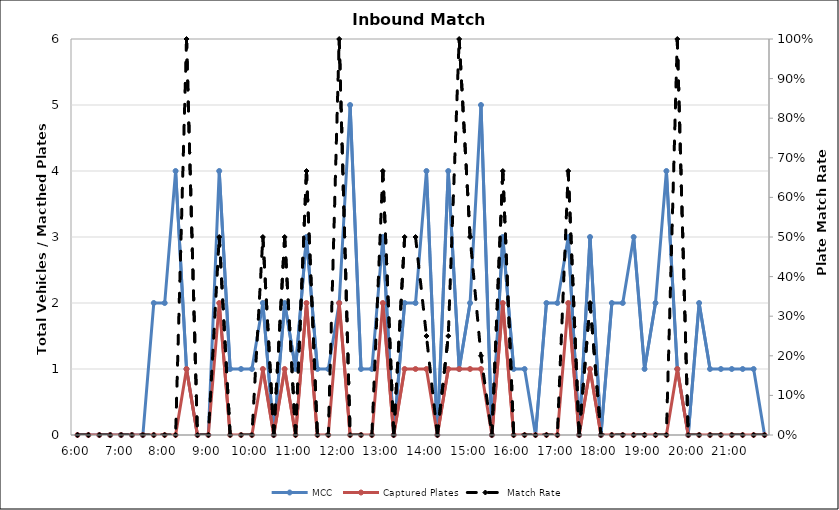
| Category | MCC | Captured Plates |
|---|---|---|
| 0.25 | 0 | 0 |
| 0.260416666666667 | 0 | 0 |
| 0.270833333333333 | 0 | 0 |
| 0.28125 | 0 | 0 |
| 0.291666666666667 | 0 | 0 |
| 0.302083333333333 | 0 | 0 |
| 0.3125 | 0 | 0 |
| 0.322916666666667 | 2 | 0 |
| 0.333333333333333 | 2 | 0 |
| 0.34375 | 4 | 0 |
| 0.354166666666667 | 1 | 1 |
| 0.364583333333333 | 0 | 0 |
| 0.375 | 0 | 0 |
| 0.385416666666667 | 4 | 2 |
| 0.395833333333333 | 1 | 0 |
| 0.40625 | 1 | 0 |
| 0.416666666666667 | 1 | 0 |
| 0.427083333333333 | 2 | 1 |
| 0.4375 | 0 | 0 |
| 0.447916666666667 | 2 | 1 |
| 0.458333333333333 | 1 | 0 |
| 0.46875 | 3 | 2 |
| 0.479166666666667 | 1 | 0 |
| 0.489583333333333 | 1 | 0 |
| 0.5 | 2 | 2 |
| 0.510416666666667 | 5 | 0 |
| 0.520833333333333 | 1 | 0 |
| 0.53125 | 1 | 0 |
| 0.541666666666667 | 3 | 2 |
| 0.552083333333333 | 0 | 0 |
| 0.5625 | 2 | 1 |
| 0.572916666666667 | 2 | 1 |
| 0.583333333333333 | 4 | 1 |
| 0.59375 | 0 | 0 |
| 0.604166666666667 | 4 | 1 |
| 0.614583333333333 | 1 | 1 |
| 0.625 | 2 | 1 |
| 0.635416666666667 | 5 | 1 |
| 0.645833333333333 | 0 | 0 |
| 0.65625 | 3 | 2 |
| 0.666666666666667 | 1 | 0 |
| 0.677083333333333 | 1 | 0 |
| 0.6875 | 0 | 0 |
| 0.697916666666667 | 2 | 0 |
| 0.708333333333333 | 2 | 0 |
| 0.71875 | 3 | 2 |
| 0.729166666666667 | 0 | 0 |
| 0.739583333333333 | 3 | 1 |
| 0.75 | 0 | 0 |
| 0.760416666666667 | 2 | 0 |
| 0.770833333333333 | 2 | 0 |
| 0.78125 | 3 | 0 |
| 0.791666666666667 | 1 | 0 |
| 0.802083333333333 | 2 | 0 |
| 0.8125 | 4 | 0 |
| 0.822916666666667 | 1 | 1 |
| 0.833333333333333 | 0 | 0 |
| 0.84375 | 2 | 0 |
| 0.854166666666667 | 1 | 0 |
| 0.864583333333333 | 1 | 0 |
| 0.875 | 1 | 0 |
| 0.885416666666667 | 1 | 0 |
| 0.895833333333333 | 1 | 0 |
| 0.90625 | 0 | 0 |